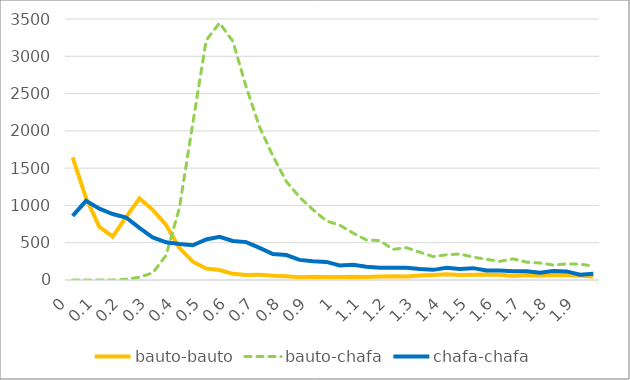
| Category | bauto-bauto | bauto-chafa | chafa-chafa |
|---|---|---|---|
| 0.0 | 1643 | 0 | 861 |
| 0.05 | 1099 | 0 | 1061 |
| 0.1 | 713 | 0 | 956 |
| 0.15 | 582 | 1 | 885 |
| 0.2 | 843 | 10 | 838 |
| 0.25 | 1094 | 37 | 700 |
| 0.3 | 941 | 96 | 570 |
| 0.35 | 739 | 332 | 505 |
| 0.4 | 428 | 971 | 482 |
| 0.45 | 245 | 2103 | 466 |
| 0.5 | 154 | 3214 | 544 |
| 0.55 | 134 | 3447 | 578 |
| 0.6 | 83 | 3201 | 523 |
| 0.65 | 66 | 2586 | 508 |
| 0.7 | 72 | 2051 | 431 |
| 0.75 | 57 | 1663 | 349 |
| 0.8 | 49 | 1322 | 334 |
| 0.85 | 38 | 1110 | 270 |
| 0.9 | 45 | 943 | 250 |
| 0.95 | 41 | 793 | 243 |
| 1.0 | 40 | 736 | 195 |
| 1.05 | 45 | 630 | 205 |
| 1.1 | 40 | 537 | 179 |
| 1.15 | 48 | 529 | 163 |
| 1.2 | 51 | 411 | 163 |
| 1.25 | 46 | 433 | 165 |
| 1.3 | 60 | 373 | 147 |
| 1.35 | 67 | 314 | 136 |
| 1.4 | 76 | 338 | 164 |
| 1.45 | 66 | 349 | 147 |
| 1.5 | 72 | 307 | 159 |
| 1.55 | 75 | 277 | 127 |
| 1.6 | 71 | 251 | 126 |
| 1.65 | 55 | 284 | 116 |
| 1.7 | 64 | 240 | 116 |
| 1.75 | 62 | 228 | 97 |
| 1.8 | 65 | 201 | 121 |
| 1.85 | 68 | 216 | 115 |
| 1.9 | 58 | 213 | 72 |
| 1.95 | 48 | 187 | 83 |